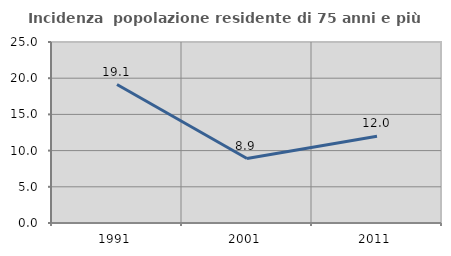
| Category | Incidenza  popolazione residente di 75 anni e più |
|---|---|
| 1991.0 | 19.126 |
| 2001.0 | 8.904 |
| 2011.0 | 11.972 |